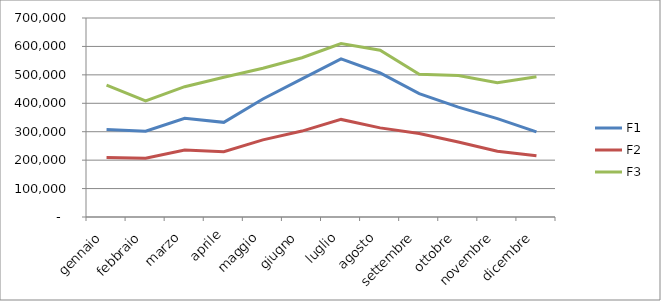
| Category |  F1  |  F2  |  F3  |
|---|---|---|---|
|  gennaio  | 308074 | 209316 | 464047 |
|  febbraio  | 301623 | 206951 | 408568 |
|  marzo  | 347149 | 235698 | 458410 |
|  aprile  | 332991 | 229529 | 491609 |
|  maggio  | 415184 | 271235 | 523297 |
|  giugno  | 485886 | 302226 | 560309 |
|  luglio  | 556475 | 343260 | 610229 |
|  agosto  | 506580 | 313529 | 586919 |
|  settembre  | 433722 | 293362 | 502213 |
|  ottobre  | 386632 | 263985 | 497902 |
|  novembre  | 346200 | 231056 | 472613 |
|  dicembre  | 299336 | 215140 | 493318 |